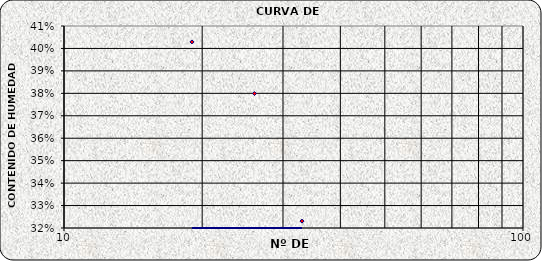
| Category | Series 0 |
|---|---|
| 33.0 | 0.323 |
| 26.0 | 0.38 |
| 19.0 | 0.403 |